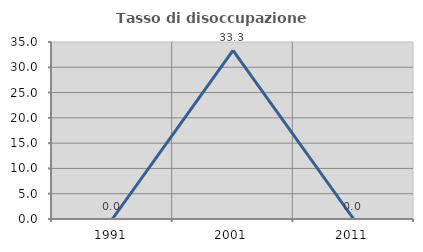
| Category | Tasso di disoccupazione giovanile  |
|---|---|
| 1991.0 | 0 |
| 2001.0 | 33.333 |
| 2011.0 | 0 |